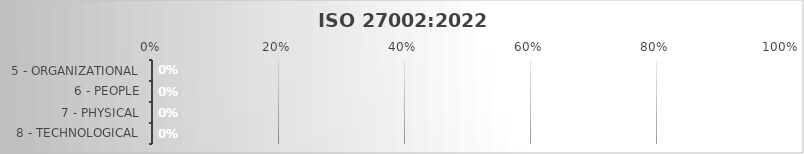
| Category | Implementation Score: |
|---|---|
| 5 - Organizational | 0 |
| 6 - People | 0 |
| 7 - Physical | 0 |
| 8 - Technological | 0 |